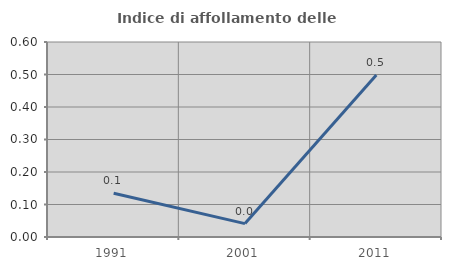
| Category | Indice di affollamento delle abitazioni  |
|---|---|
| 1991.0 | 0.135 |
| 2001.0 | 0.041 |
| 2011.0 | 0.499 |